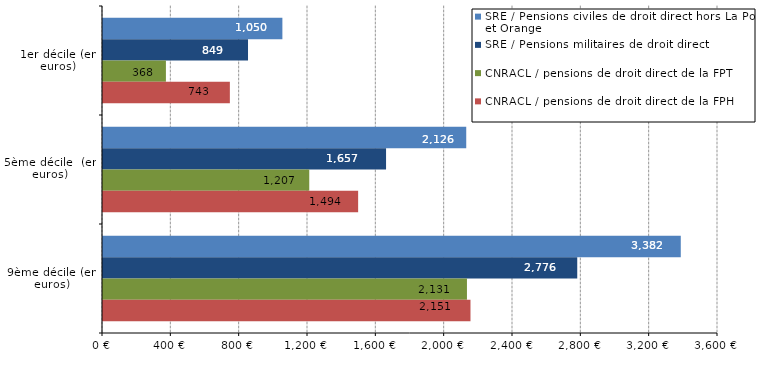
| Category | SRE / Pensions civiles de droit direct hors La Poste et Orange | SRE / Pensions militaires de droit direct | CNRACL / pensions de droit direct de la FPT | CNRACL / pensions de droit direct de la FPH |
|---|---|---|---|---|
| 1er décile (en euros) | 1050.05 | 848.85 | 368.3 | 742.6 |
| 5ème décile  (en euros) | 2126.28 | 1656.89 | 1207.4 | 1493.5 |
| 9ème décile (en euros) | 3382.09 | 2776.07 | 2130.5 | 2151.1 |